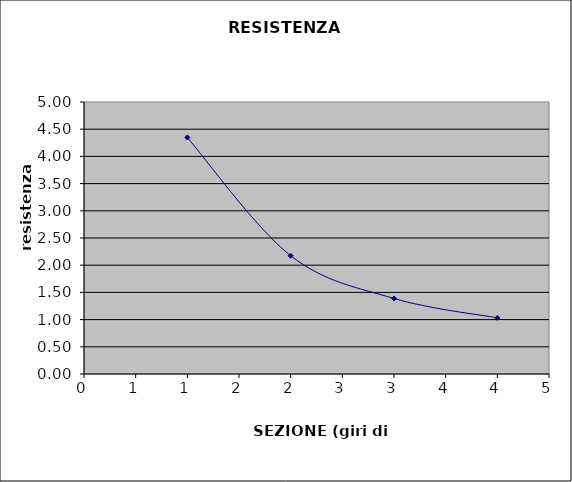
| Category | Series 0 |
|---|---|
| 1.0 | 4.348 |
| 2.0 | 2.174 |
| 3.0 | 1.389 |
| 4.0 | 1.031 |